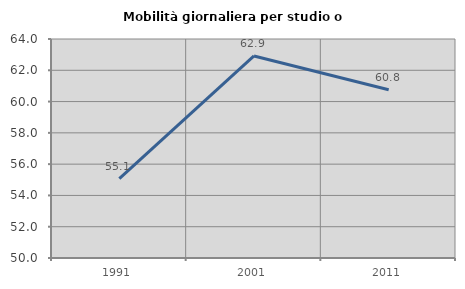
| Category | Mobilità giornaliera per studio o lavoro |
|---|---|
| 1991.0 | 55.081 |
| 2001.0 | 62.914 |
| 2011.0 | 60.754 |